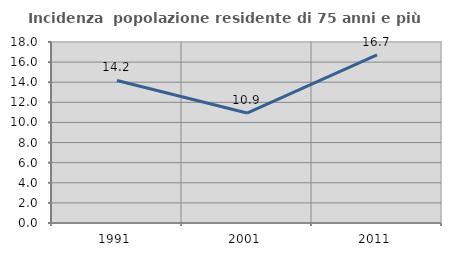
| Category | Incidenza  popolazione residente di 75 anni e più |
|---|---|
| 1991.0 | 14.177 |
| 2001.0 | 10.933 |
| 2011.0 | 16.712 |